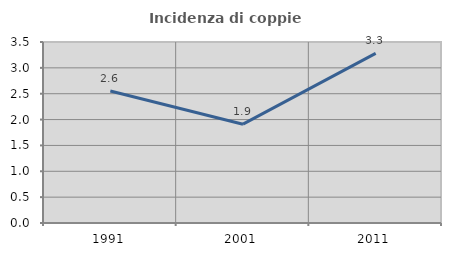
| Category | Incidenza di coppie miste |
|---|---|
| 1991.0 | 2.553 |
| 2001.0 | 1.911 |
| 2011.0 | 3.279 |